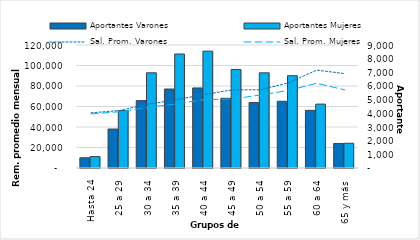
| Category | Aportantes Varones | Aportantes Mujeres |
|---|---|---|
| Hasta 24 | 748 | 837 |
| 25 a 29 | 2851 | 4199 |
| 30 a 34 | 4929 | 6966 |
| 35 a 39 | 5779 | 8342 |
| 40 a 44 | 5857 | 8551 |
| 45 a 49 | 5101 | 7206 |
| 50 a 54 | 4789 | 6963 |
| 55 a 59 | 4881 | 6754 |
| 60 a 64 | 4218 | 4675 |
| 65 y más | 1795 | 1807 |